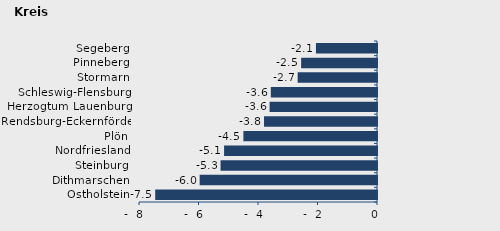
| Category | Überschuss der Geborenen (+) bzw. Gestorbenen (-) |
|---|---|
| Ostholstein | -7.455 |
| Dithmarschen | -5.961 |
| Steinburg | -5.259 |
| Nordfriesland | -5.14 |
| Plön | -4.492 |
| Rendsburg-Eckernförde | -3.798 |
| Herzogtum Lauenburg | -3.611 |
| Schleswig-Flensburg | -3.569 |
| Stormarn | -2.666 |
| Pinneberg | -2.55 |
| Segeberg | -2.053 |